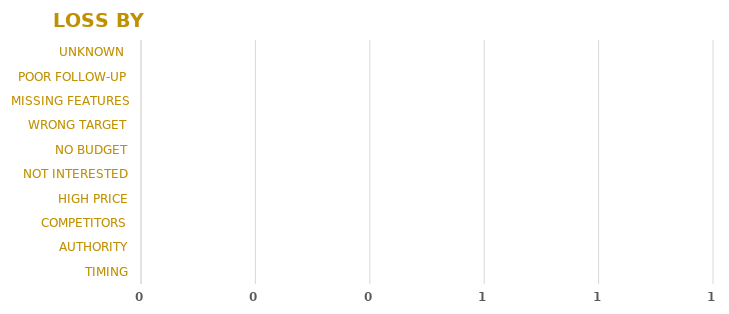
| Category | Series 0 |
|---|---|
| TIMING | 0 |
| AUTHORITY | 0 |
| COMPETITORS | 0 |
| HIGH PRICE | 0 |
| NOT INTERESTED | 0 |
| NO BUDGET | 0 |
| WRONG TARGET | 0 |
| MISSING FEATURES | 0 |
| POOR FOLLOW-UP | 0 |
| UNKNOWN  | 0 |